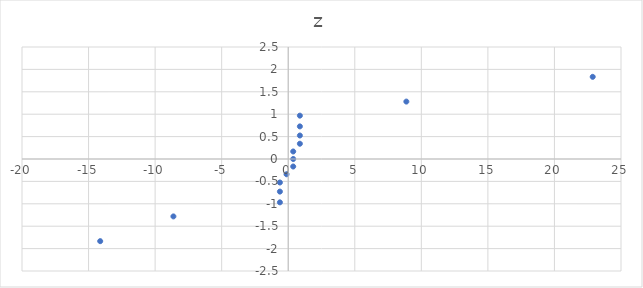
| Category | z |
|---|---|
| -14.125 | -1.834 |
| -8.625 | -1.282 |
| -0.625 | -0.967 |
| -0.625 | -0.728 |
| -0.625 | -0.524 |
| -0.125 | -0.341 |
| 0.375 | -0.168 |
| 0.375 | 0 |
| 0.375 | 0.168 |
| 0.875 | 0.341 |
| 0.875 | 0.524 |
| 0.875 | 0.728 |
| 0.875 | 0.967 |
| 8.875 | 1.282 |
| 22.875 | 1.834 |